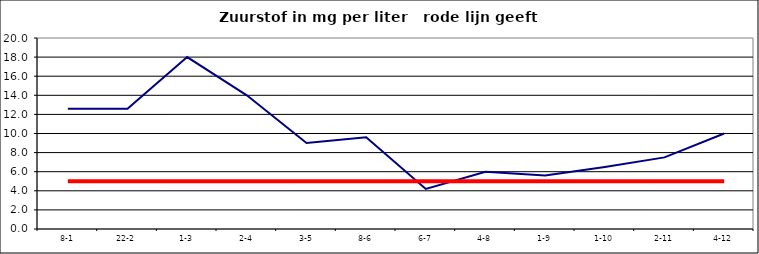
| Category | Series 0 | Series 1 |
|---|---|---|
| 8-1 | 12.6 | 5 |
| 22-2 | 12.6 | 5 |
| 1-3 | 18 | 5 |
| 2-4 | 14 | 5 |
| 3-5 | 9 | 5 |
| 8-6 | 9.6 | 5 |
| 6-7 | 4.2 | 5 |
| 4-8 | 6 | 5 |
| 1-9 | 5.6 | 5 |
| 1-10 | 6.5 | 5 |
| 2-11 | 7.5 | 5 |
| 4-12 | 10 | 5 |